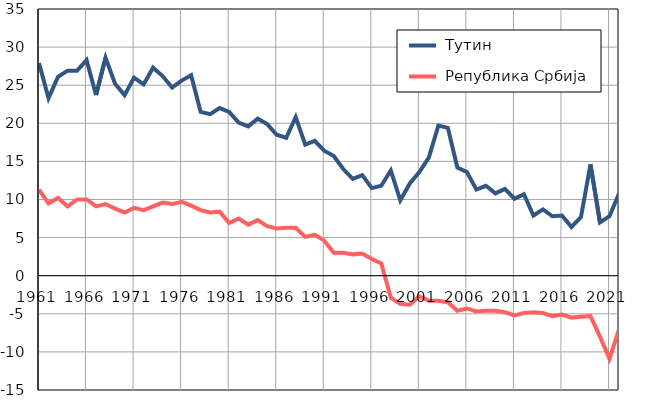
| Category |  Тутин |  Република Србија |
|---|---|---|
| 1961.0 | 27.9 | 11.3 |
| 1962.0 | 23.3 | 9.5 |
| 1963.0 | 26.1 | 10.2 |
| 1964.0 | 26.9 | 9.1 |
| 1965.0 | 26.9 | 10 |
| 1966.0 | 28.3 | 10 |
| 1967.0 | 23.7 | 9.1 |
| 1968.0 | 28.6 | 9.4 |
| 1969.0 | 25.2 | 8.8 |
| 1970.0 | 23.7 | 8.3 |
| 1971.0 | 26 | 8.9 |
| 1972.0 | 25.1 | 8.6 |
| 1973.0 | 27.3 | 9.1 |
| 1974.0 | 26.2 | 9.6 |
| 1975.0 | 24.7 | 9.4 |
| 1976.0 | 25.6 | 9.7 |
| 1977.0 | 26.3 | 9.2 |
| 1978.0 | 21.5 | 8.6 |
| 1979.0 | 21.2 | 8.3 |
| 1980.0 | 22 | 8.4 |
| 1981.0 | 21.5 | 6.9 |
| 1982.0 | 20.1 | 7.5 |
| 1983.0 | 19.6 | 6.7 |
| 1984.0 | 20.6 | 7.3 |
| 1985.0 | 19.9 | 6.5 |
| 1986.0 | 18.5 | 6.2 |
| 1987.0 | 18.1 | 6.3 |
| 1988.0 | 20.8 | 6.3 |
| 1989.0 | 17.2 | 5.1 |
| 1990.0 | 17.7 | 5.4 |
| 1991.0 | 16.4 | 4.6 |
| 1992.0 | 15.7 | 3 |
| 1993.0 | 14 | 3 |
| 1994.0 | 12.7 | 2.8 |
| 1995.0 | 13.2 | 2.9 |
| 1996.0 | 11.5 | 2.2 |
| 1997.0 | 11.8 | 1.6 |
| 1998.0 | 13.8 | -2.9 |
| 1999.0 | 9.9 | -3.7 |
| 2000.0 | 12.1 | -3.8 |
| 2001.0 | 13.6 | -2.7 |
| 2002.0 | 15.5 | -3.3 |
| 2003.0 | 19.7 | -3.3 |
| 2004.0 | 19.4 | -3.5 |
| 2005.0 | 14.2 | -4.6 |
| 2006.0 | 13.6 | -4.3 |
| 2007.0 | 11.3 | -4.7 |
| 2008.0 | 11.8 | -4.6 |
| 2009.0 | 10.8 | -4.6 |
| 2010.0 | 11.4 | -4.8 |
| 2011.0 | 10.1 | -5.2 |
| 2012.0 | 10.7 | -4.9 |
| 2013.0 | 7.9 | -4.8 |
| 2014.0 | 8.7 | -4.9 |
| 2015.0 | 7.8 | -5.3 |
| 2016.0 | 7.9 | -5.1 |
| 2017.0 | 6.4 | -5.5 |
| 2018.0 | 7.7 | -5.4 |
| 2019.0 | 14.6 | -5.3 |
| 2020.0 | 7 | -8 |
| 2021.0 | 7.8 | -10.9 |
| 2022.0 | 10.8 | -7 |